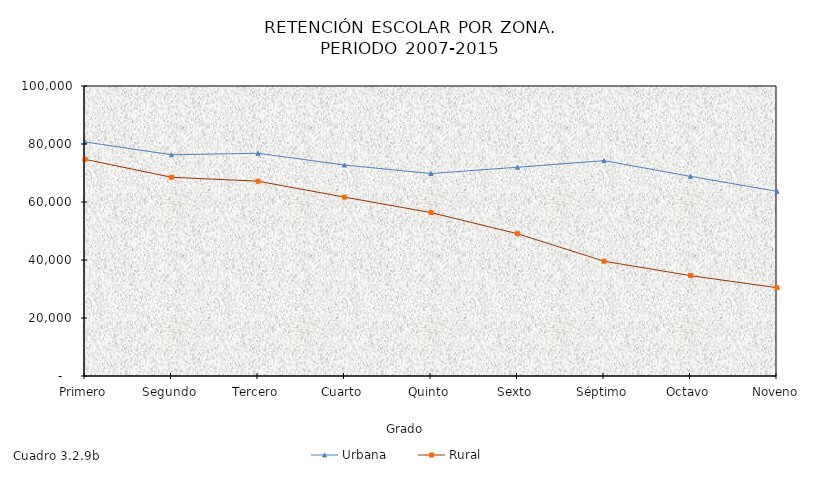
| Category | Urbana | Rural |
|---|---|---|
| Primero | 80707 | 74709 |
| Segundo | 76290 | 68524 |
| Tercero | 76804 | 67176 |
| Cuarto | 72747 | 61687 |
| Quinto | 69809 | 56336 |
| Sexto | 71992 | 49059 |
| Séptimo | 74255 | 39589 |
| Octavo | 68846 | 34610 |
| Noveno | 63685 | 30445 |